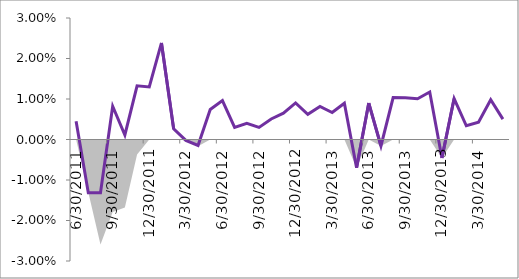
| Category | Series 1 |
|---|---|
| 0 | 0.004 |
| 01/01/1900 | -0.013 |
| 02/01/1900 | -0.013 |
| 03/01/1900 | 0.008 |
| 04/01/1900 | 0.001 |
| 05/01/1900 | 0.013 |
| 06/01/1900 | 0.013 |
| 07/01/1900 | 0.024 |
| 08/01/1900 | 0.003 |
| 09/01/1900 | 0 |
| 10/01/1900 | -0.001 |
| 11/01/1900 | 0.007 |
| 12/01/1900 | 0.01 |
| 13/01/1900 | 0.003 |
| 14/01/1900 | 0.004 |
| 15/01/1900 | 0.003 |
| 16/01/1900 | 0.005 |
| 17/01/1900 | 0.007 |
| 18/01/1900 | 0.009 |
| 19/01/1900 | 0.006 |
| 20/01/1900 | 0.008 |
| 21/01/1900 | 0.007 |
| 22/01/1900 | 0.009 |
| 23/01/1900 | -0.007 |
| 24/01/1900 | 0.009 |
| 25/01/1900 | -0.002 |
| 26/01/1900 | 0.01 |
| 27/01/1900 | 0.01 |
| 28/01/1900 | 0.01 |
| 29/01/1900 | 0.012 |
| 30/01/1900 | -0.005 |
| 31/01/1900 | 0.01 |
| 01/02/1900 | 0.003 |
| 02/02/1900 | 0.004 |
| 03/02/1900 | 0.01 |
| 04/02/1900 | 0.005 |